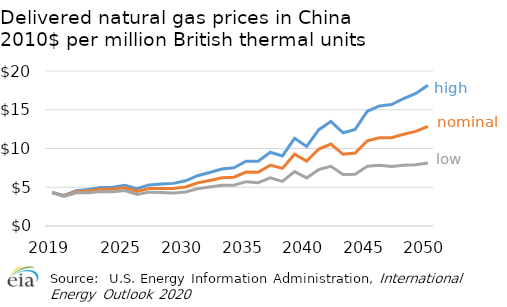
| Category | HNGP | ref | LNGP |
|---|---|---|---|
| 2019.0 | 4.318 | 4.318 | 4.318 |
| nan | 3.942 | 3.88 | 3.817 |
| nan | 4.558 | 4.417 | 4.275 |
| nan | 4.726 | 4.51 | 4.293 |
| nan | 4.97 | 4.729 | 4.46 |
| nan | 4.989 | 4.729 | 4.415 |
| 2025.0 | 5.245 | 4.95 | 4.569 |
| nan | 4.812 | 4.457 | 4.076 |
| nan | 5.305 | 4.825 | 4.368 |
| nan | 5.415 | 4.839 | 4.331 |
| nan | 5.499 | 4.831 | 4.271 |
| 2030.0 | 5.828 | 5.034 | 4.391 |
| nan | 6.487 | 5.565 | 4.81 |
| nan | 6.899 | 5.874 | 5.023 |
| nan | 7.35 | 6.211 | 5.249 |
| nan | 7.516 | 6.301 | 5.254 |
| 2035.0 | 8.368 | 6.958 | 5.721 |
| nan | 8.366 | 6.931 | 5.587 |
| nan | 9.519 | 7.858 | 6.211 |
| nan | 9.044 | 7.432 | 5.752 |
| nan | 11.314 | 9.259 | 7.017 |
| 2040.0 | 10.273 | 8.365 | 6.2 |
| nan | 12.434 | 9.932 | 7.3 |
| nan | 13.484 | 10.571 | 7.696 |
| nan | 12.025 | 9.253 | 6.658 |
| nan | 12.458 | 9.416 | 6.69 |
| 2045.0 | 14.805 | 11.001 | 7.713 |
| nan | 15.497 | 11.389 | 7.842 |
| nan | 15.668 | 11.395 | 7.693 |
| nan | 16.448 | 11.844 | 7.837 |
| nan | 17.103 | 12.202 | 7.901 |
| 2050.0 | 18.172 | 12.856 | 8.138 |